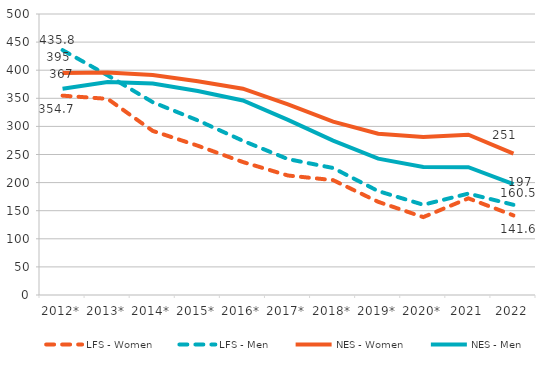
| Category | LFS - Women | LFS - Men | NES - Women | NES - Men |
|---|---|---|---|---|
| 2012* | 354.7 | 435.8 | 394.992 | 366.841 |
| 2013* | 349 | 390.8 | 395.985 | 378.905 |
| 2014* | 292 | 343.1 | 391.279 | 376.156 |
| 2015* | 265.6 | 310.7 | 380.274 | 362.884 |
| 2016* | 236.6 | 274.4 | 367.096 | 346.057 |
| 2017* | 212.6 | 241.8 | 339.047 | 311.525 |
| 2018* | 204.4 | 226 | 308.49 | 274.608 |
| 2019* | 165.8 | 184.9 | 286.872 | 242.635 |
| 2020* | 138.6 | 160.6 | 281.219 | 227.96 |
| 2021 | 171.996 | 180.422 | 285.323 | 227.521 |
| 2022 | 141.63 | 160.536 | 251.414 | 197.204 |